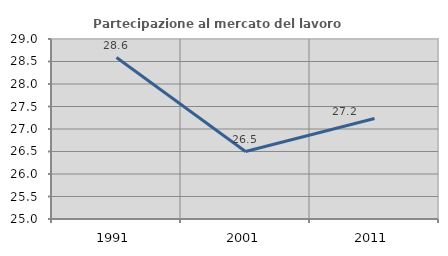
| Category | Partecipazione al mercato del lavoro  femminile |
|---|---|
| 1991.0 | 28.587 |
| 2001.0 | 26.499 |
| 2011.0 | 27.232 |